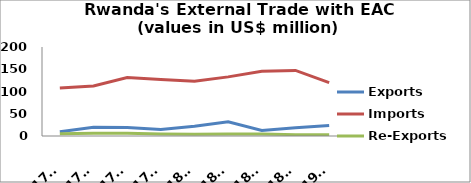
| Category | Exports | Imports | Re-Exports |
|---|---|---|---|
| 2017Q1 | 9.664 | 107.939 | 4.884 |
| 2017Q2 | 19.646 | 112.299 | 6.46 |
| 2017Q3 | 18.919 | 131.397 | 5.955 |
| 2017Q4 | 14.466 | 126.939 | 4.636 |
| 2018Q1 | 21.787 | 122.952 | 3.88 |
| 2018Q2 | 31.913 | 132.868 | 4.622 |
| 2018Q3 | 12.298 | 145.348 | 4.725 |
| 2018Q4 | 18.335 | 147.432 | 2.99 |
| 2019Q1 | 23.42 | 119.935 | 2.57 |